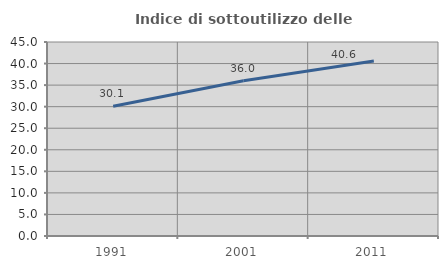
| Category | Indice di sottoutilizzo delle abitazioni  |
|---|---|
| 1991.0 | 30.116 |
| 2001.0 | 36.017 |
| 2011.0 | 40.576 |